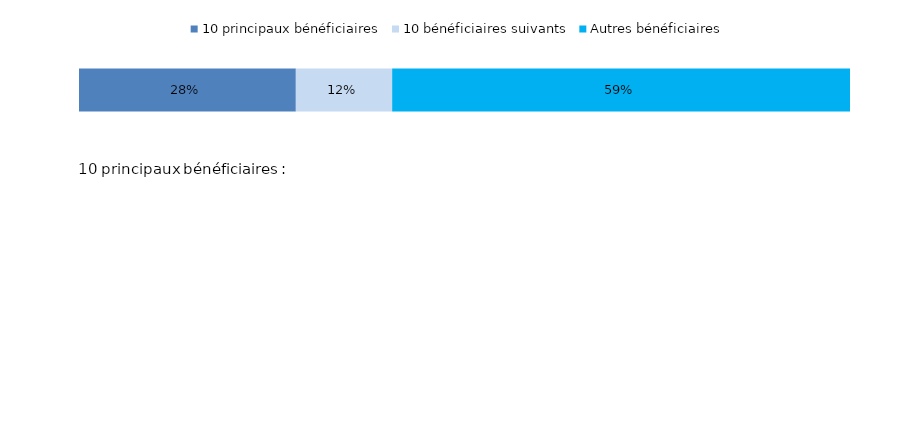
| Category | 10 principaux bénéficiaires | 10 bénéficiaires suivants | Autres bénéficiaires |
|---|---|---|---|
| 0 | 0.281 | 0.125 | 0.594 |